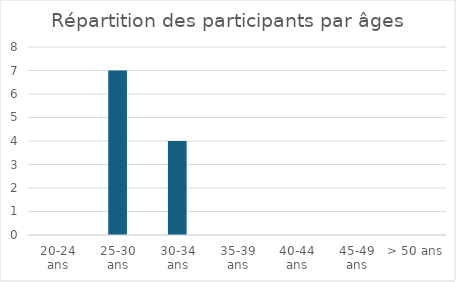
| Category | Series 0 |
|---|---|
| 20-24 ans | 0 |
| 25-30 ans | 7 |
| 30-34 ans | 4 |
| 35-39 ans | 0 |
| 40-44 ans | 0 |
| 45-49 ans | 0 |
| > 50 ans | 0 |